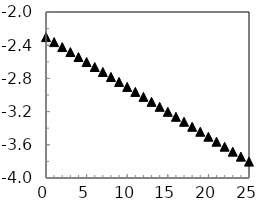
| Category | Series 2 |
|---|---|
| 0.0 | -2.303 |
| 1.0 | -2.363 |
| 2.0 | -2.423 |
| 3.0 | -2.483 |
| 4.0 | -2.543 |
| 5.0 | -2.603 |
| 6.0 | -2.663 |
| 7.0 | -2.723 |
| 8.0 | -2.783 |
| 9.0 | -2.843 |
| 10.0 | -2.903 |
| 11.0 | -2.963 |
| 12.0 | -3.023 |
| 13.0 | -3.083 |
| 14.0 | -3.143 |
| 15.0 | -3.203 |
| 16.0 | -3.263 |
| 17.0 | -3.323 |
| 18.0 | -3.383 |
| 19.0 | -3.443 |
| 20.0 | -3.503 |
| 21.0 | -3.563 |
| 22.0 | -3.623 |
| 23.0 | -3.683 |
| 24.0 | -3.743 |
| 25.0 | -3.803 |